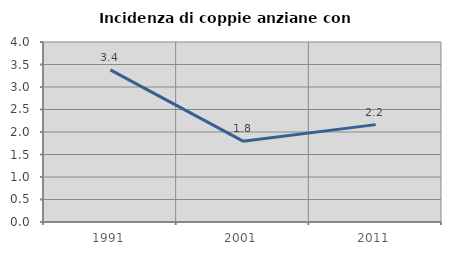
| Category | Incidenza di coppie anziane con figli |
|---|---|
| 1991.0 | 3.379 |
| 2001.0 | 1.796 |
| 2011.0 | 2.164 |